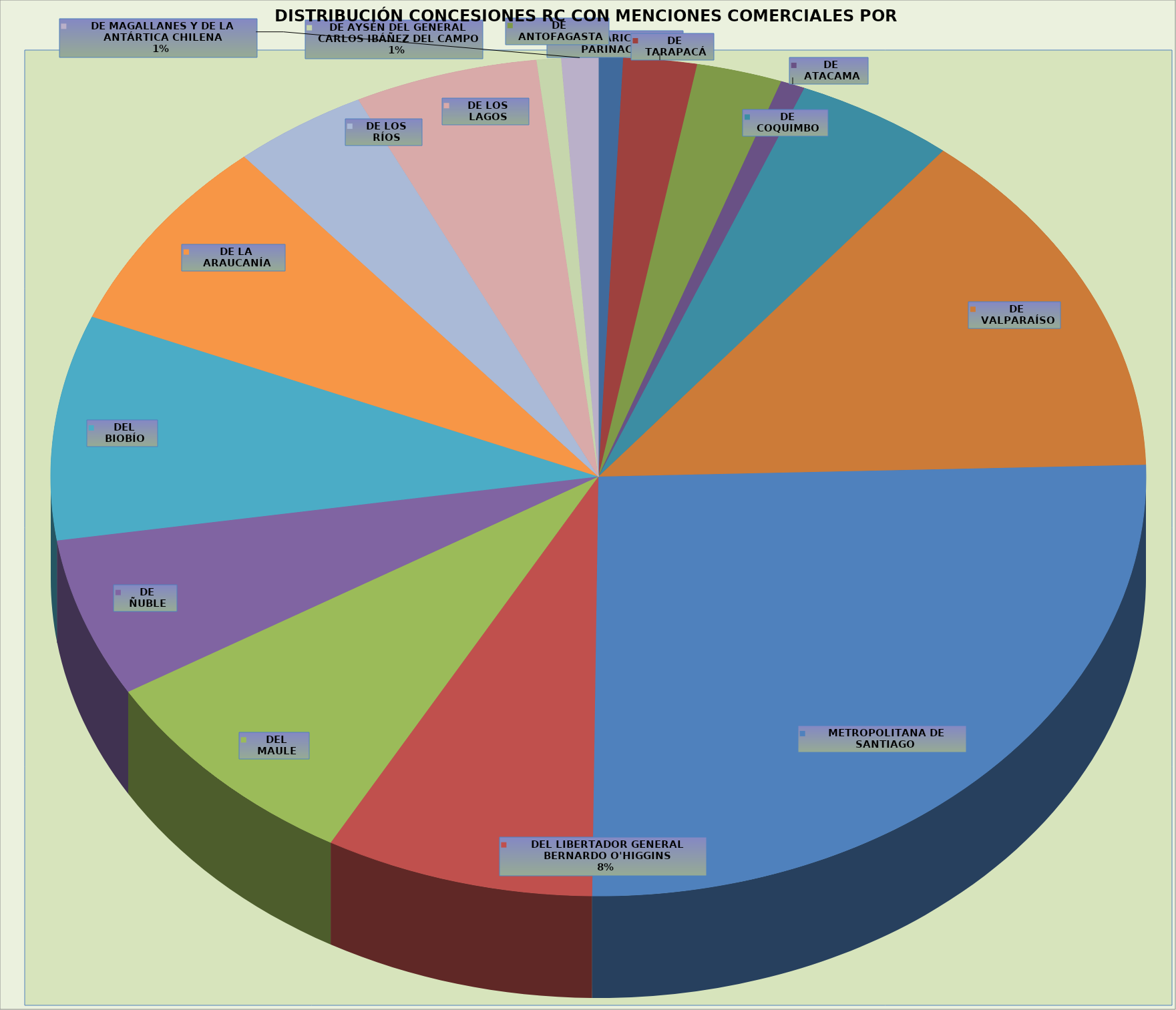
| Category | Total |
|---|---|
| DE ARICA Y PARINACOTA | 2 |
| DE TARAPACÁ | 6 |
| DE ANTOFAGASTA | 7 |
| DE ATACAMA | 2 |
| DE COQUIMBO | 13 |
| DE VALPARAÍSO | 38 |
| METROPOLITANA DE SANTIAGO | 71 |
| DEL LIBERTADOR GENERAL BERNARDO O'HIGGINS | 22 |
| DEL MAULE | 23 |
| DE ÑUBLE | 17 |
| DEL BIOBÍO | 24 |
| DE LA ARAUCANÍA | 21 |
| DE LOS RÍOS | 11 |
| DE LOS LAGOS | 15 |
| DE AYSÉN DEL GENERAL CARLOS IBÁÑEZ DEL CAMPO | 2 |
| DE MAGALLANES Y DE LA ANTÁRTICA CHILENA | 3 |